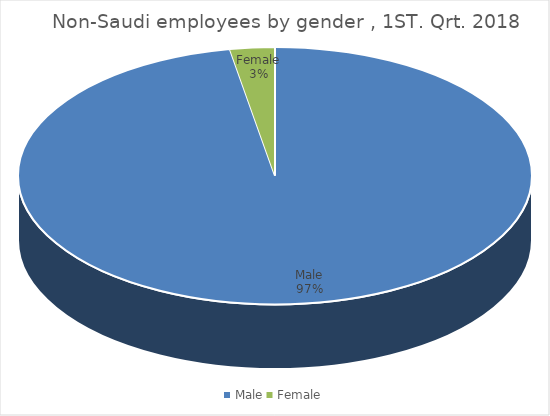
| Category | Series 0 |
|---|---|
| Male | 4593998 |
| Female | 133015 |